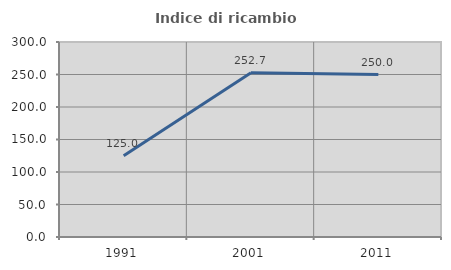
| Category | Indice di ricambio occupazionale  |
|---|---|
| 1991.0 | 125 |
| 2001.0 | 252.727 |
| 2011.0 | 250 |